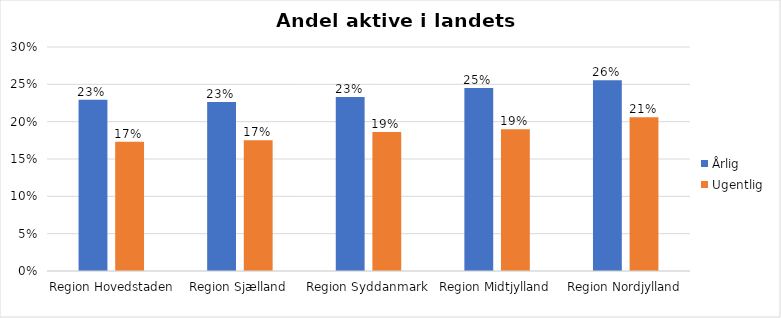
| Category | Årlig | Ugentlig |
|---|---|---|
| Region Hovedstaden | 0.229 | 0.173 |
| Region Sjælland | 0.226 | 0.175 |
| Region Syddanmark | 0.233 | 0.186 |
| Region Midtjylland | 0.245 | 0.19 |
| Region Nordjylland | 0.256 | 0.206 |